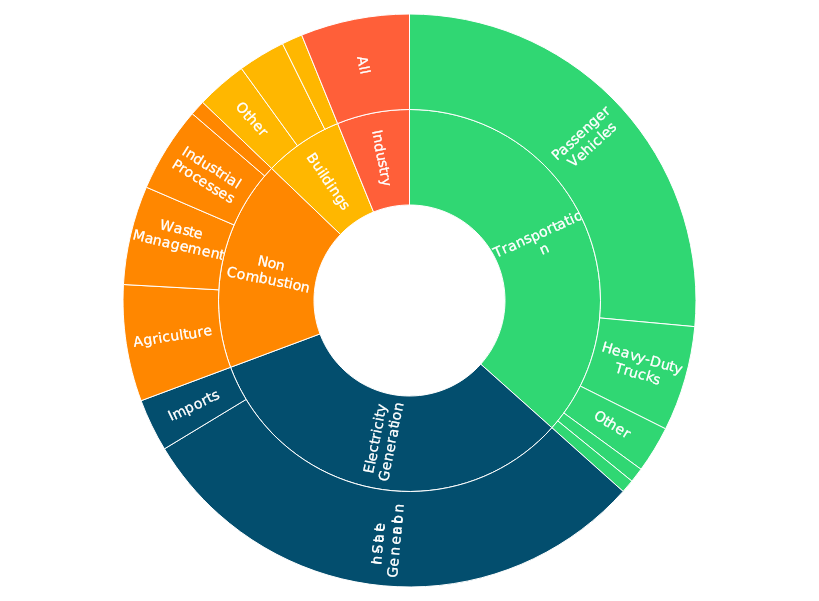
| Category | NWL | Waste | Oil & Gas Systems | IPPU | Agriculture | Transportation | Industrial | Commercial | Residential | Electric Power |
|---|---|---|---|---|---|---|---|---|---|---|
| PATHWAYS | -42.13 | 8.93 | 1.37 | 7.73 | 10.52 | 57.36 | 11.02 | 5.21 | 5.51 | 52.318 |
| NC GHG Inventory | -42.13 | 8.944 | 1.368 | 7.732 | 10.521 | 57.315 | 10.426 | 5.223 | 5.635 | 52.318 |